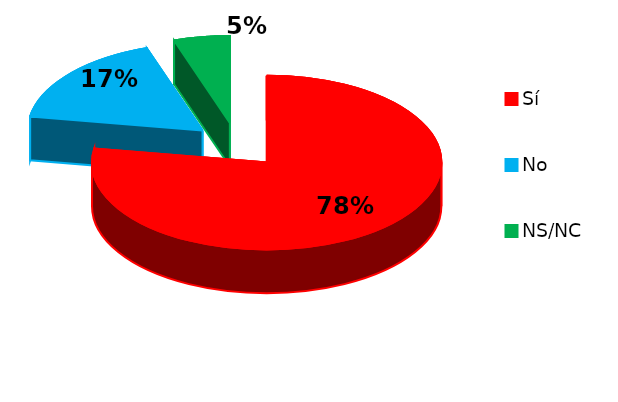
| Category | Series 0 |
|---|---|
| Sí | 90 |
| No | 20 |
| NS/NC | 6 |